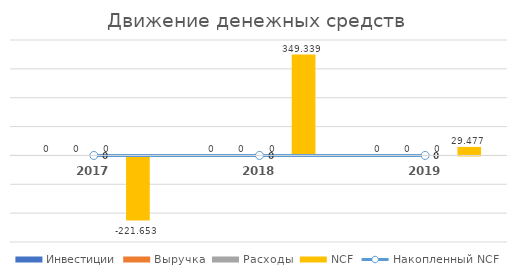
| Category | Инвестиции | Выручка | Расходы | NCF |
|---|---|---|---|---|
| 2017.0 | -458.25 | 289.204 | -52.607 | -221.653 |
| 2018.0 | 0 | 408.746 | -59.407 | 349.339 |
| 2019.0 | 0 | 33.984 | -4.507 | 29.477 |